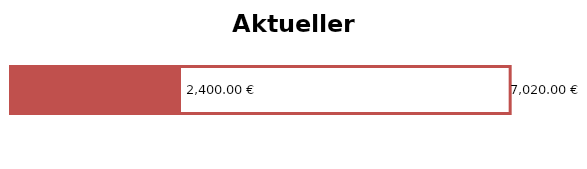
| Category | Einkommen insg. | Ausgaben insg. |
|---|---|---|
| 0 | 7020 | 2400 |